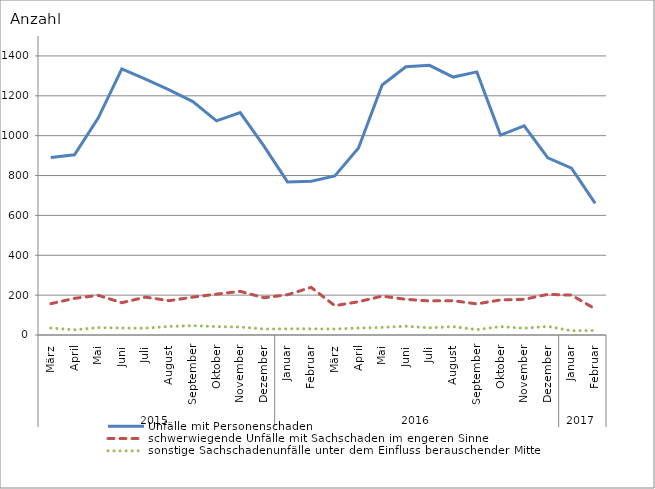
| Category | Unfälle mit Personenschaden | schwerwiegende Unfälle mit Sachschaden im engeren Sinne | sonstige Sachschadenunfälle unter dem Einfluss berauschender Mittel |
|---|---|---|---|
| 0 | 891 | 157 | 35 |
| 1 | 904 | 184 | 26 |
| 2 | 1088 | 199 | 37 |
| 3 | 1335 | 162 | 35 |
| 4 | 1284 | 190 | 34 |
| 5 | 1230 | 172 | 43 |
| 6 | 1171 | 190 | 47 |
| 7 | 1074 | 205 | 42 |
| 8 | 1116 | 219 | 40 |
| 9 | 949 | 187 | 30 |
| 10 | 768 | 202 | 31 |
| 11 | 771 | 239 | 31 |
| 12 | 798 | 147 | 30 |
| 13 | 938 | 167 | 35 |
| 14 | 1254 | 195 | 38 |
| 15 | 1346 | 179 | 44 |
| 16 | 1353 | 171 | 36 |
| 17 | 1294 | 172 | 42 |
| 18 | 1320 | 156 | 27 |
| 19 | 1003 | 176 | 42 |
| 20 | 1049 | 179 | 34 |
| 21 | 889 | 204 | 43 |
| 22 | 837 | 200 | 21 |
| 23 | 660 | 131 | 23 |